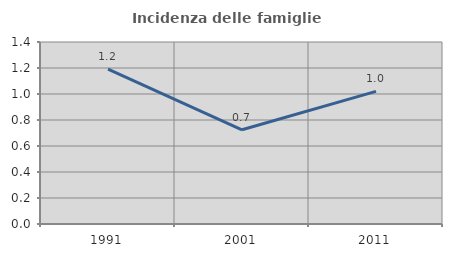
| Category | Incidenza delle famiglie numerose |
|---|---|
| 1991.0 | 1.19 |
| 2001.0 | 0.725 |
| 2011.0 | 1.02 |